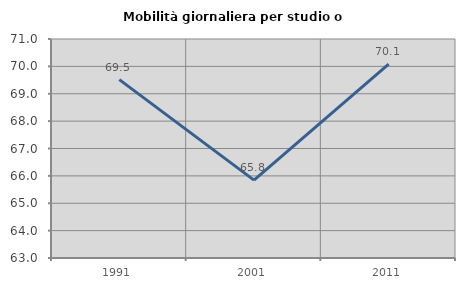
| Category | Mobilità giornaliera per studio o lavoro |
|---|---|
| 1991.0 | 69.516 |
| 2001.0 | 65.845 |
| 2011.0 | 70.083 |